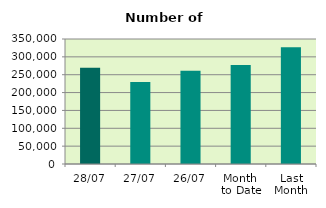
| Category | Series 0 |
|---|---|
| 28/07 | 269806 |
| 27/07 | 229316 |
| 26/07 | 261374 |
| Month 
to Date | 277368.7 |
| Last
Month | 326674.818 |